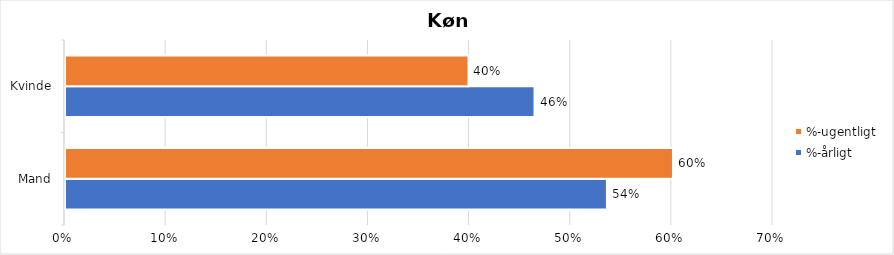
| Category | %-årligt | %-ugentligt |
|---|---|---|
| Mand | 0.536 | 0.601 |
| Kvinde | 0.464 | 0.399 |